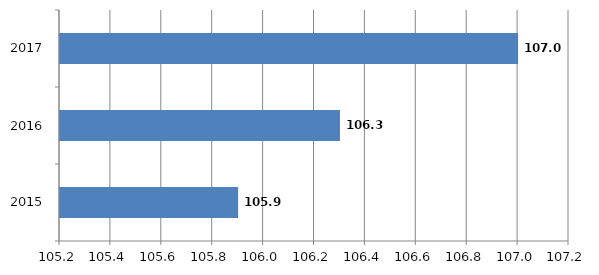
| Category | Series 0 |
|---|---|
| 2015.0 | 105.9 |
| 2016.0 | 106.3 |
| 2017.0 | 107 |